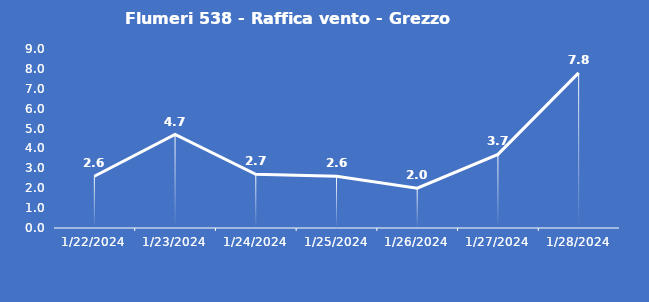
| Category | Flumeri 538 - Raffica vento - Grezzo (m/s) |
|---|---|
| 1/22/24 | 2.6 |
| 1/23/24 | 4.7 |
| 1/24/24 | 2.7 |
| 1/25/24 | 2.6 |
| 1/26/24 | 2 |
| 1/27/24 | 3.7 |
| 1/28/24 | 7.8 |